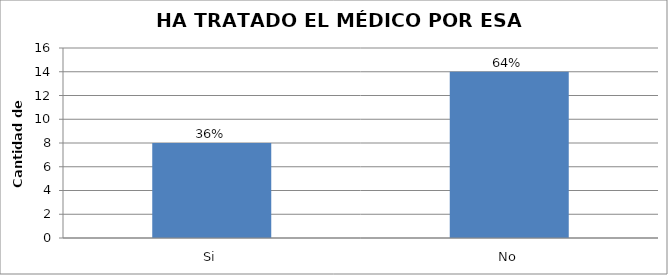
| Category | Series 0 |
|---|---|
| Si | 8 |
| No | 14 |